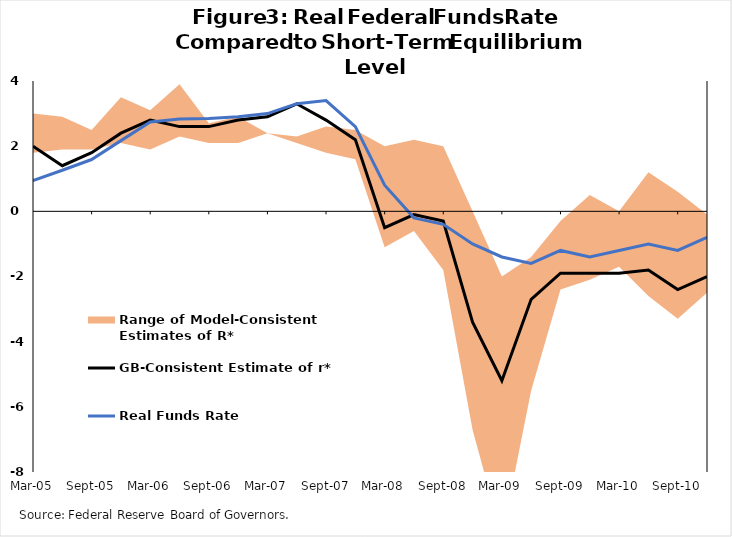
| Category | GB-Consistent Estimate of r* | Real Funds Rate |
|---|---|---|
| 2005-03-16 | 2 | 0.94 |
| 2005-06-22 | 1.4 | 1.26 |
| 2005-09-14 | 1.8 | 1.59 |
| 2005-12-07 | 2.4 | 2.17 |
| 2006-03-22 | 2.8 | 2.74 |
| 2006-06-21 | 2.6 | 2.83 |
| 2006-09-13 | 2.6 | 2.85 |
| 2006-12-06 | 2.8 | 2.9 |
| 2007-03-14 | 2.9 | 3 |
| 2007-06-20 | 3.3 | 3.3 |
| 2007-09-12 | 2.8 | 3.4 |
| 2007-12-05 | 2.2 | 2.6 |
| 2008-03-13 | -0.5 | 0.8 |
| 2008-06-18 | -0.1 | -0.2 |
| 2008-09-10 | -0.3 | -0.4 |
| 2008-12-10 | -3.4 | -1 |
| 2009-03-12 | -5.2 | -1.4 |
| 2009-06-17 | -2.7 | -1.6 |
| 2009-09-16 | -1.9 | -1.2 |
| 2009-12-09 | -1.9 | -1.4 |
| 2010-03-10 | -1.9 | -1.2 |
| 2010-06-16 | -1.8 | -1 |
| 2010-09-15 | -2.4 | -1.2 |
| 2010-12-08 | -2 | -0.8 |